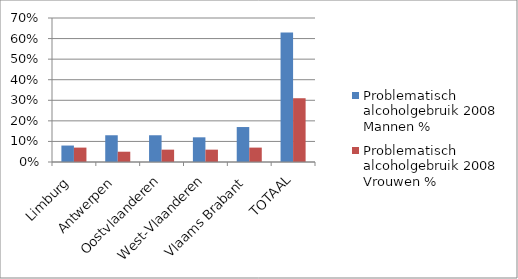
| Category | Problematisch alcoholgebruik 2008 Mannen % | Problematisch alcoholgebruik 2008 Vrouwen % |
|---|---|---|
| Limburg | 0.08 | 0.07 |
| Antwerpen | 0.13 | 0.05 |
| Oostvlaanderen | 0.13 | 0.06 |
| West-Vlaanderen | 0.12 | 0.06 |
| Vlaams Brabant | 0.17 | 0.07 |
| TOTAAL | 0.63 | 0.31 |